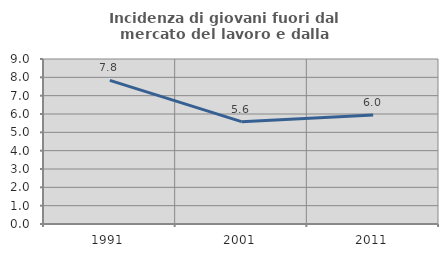
| Category | Incidenza di giovani fuori dal mercato del lavoro e dalla formazione  |
|---|---|
| 1991.0 | 7.833 |
| 2001.0 | 5.582 |
| 2011.0 | 5.951 |